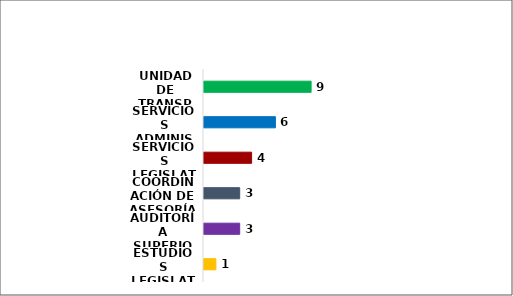
| Category | Series 0 |
|---|---|
| ESTUDIOS LEGISLATIVOS | 1 |
| AUDITORÍA SUPERIOR | 3 |
| COORDINACIÓN DE ASESORÍA | 3 |
| SERVICIOS LEGISLATIVOS | 4 |
| SERVICIOS ADMINISTRATIVOS | 6 |
| UNIDAD DE TRANSPARENCIA | 9 |